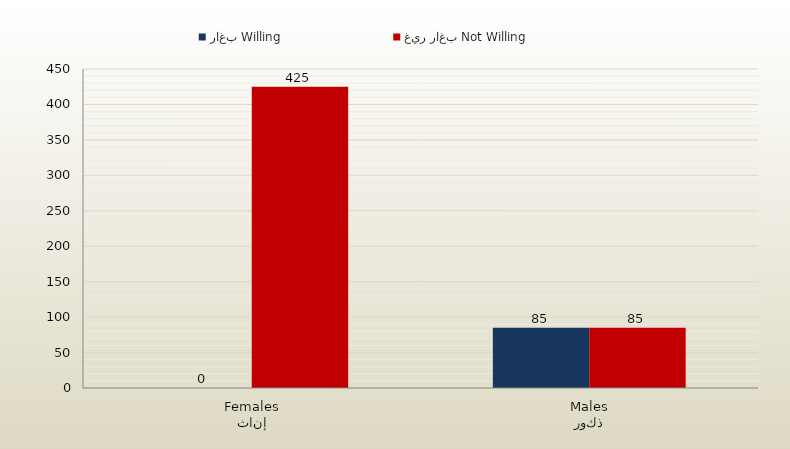
| Category | راغب Willing | غير راغب Not Willing |
|---|---|---|
| إناث
Females | 0 | 425 |
| ذكور
Males | 85 | 85 |